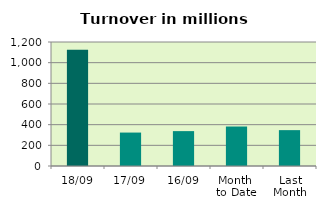
| Category | Series 0 |
|---|---|
| 18/09 | 1124.218 |
| 17/09 | 323.53 |
| 16/09 | 337.547 |
| Month 
to Date | 382.15 |
| Last
Month | 347.074 |